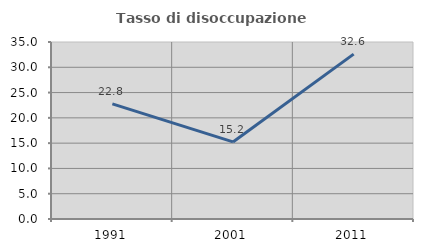
| Category | Tasso di disoccupazione giovanile  |
|---|---|
| 1991.0 | 22.768 |
| 2001.0 | 15.238 |
| 2011.0 | 32.609 |